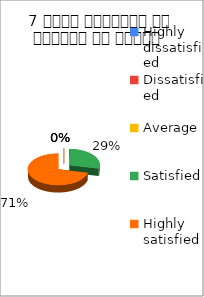
| Category | 7 विषय अवधारणा पर शिक्षक का ज्ञान  |
|---|---|
| Highly dissatisfied | 0 |
| Dissatisfied | 0 |
| Average | 0 |
| Satisfied | 2 |
| Highly satisfied | 5 |